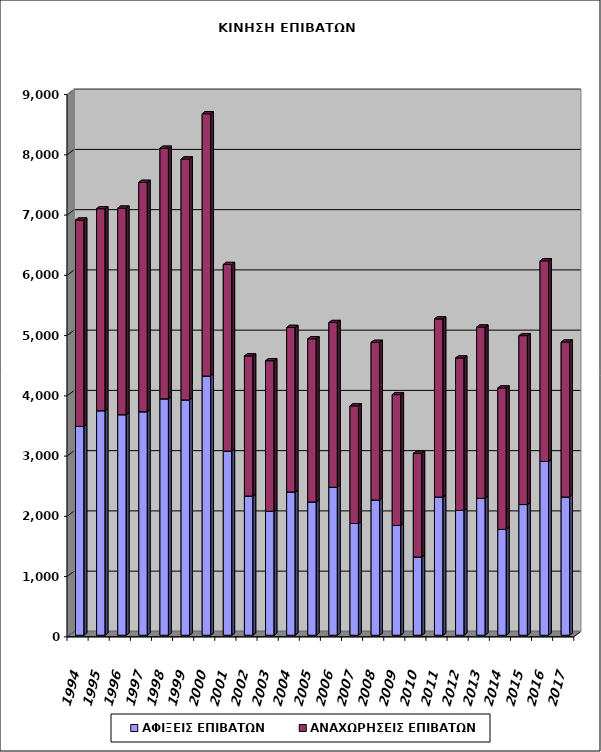
| Category | ΑΦΙΞΕΙΣ ΕΠΙΒΑΤΩΝ | ΑΝΑΧΩΡΗΣΕΙΣ ΕΠΙΒΑΤΩΝ |
|---|---|---|
| 1994.0 | 3466 | 3424 |
| 1995.0 | 3726 | 3353 |
| 1996.0 | 3660 | 3428 |
| 1997.0 | 3709 | 3807 |
| 1998.0 | 3923 | 4159 |
| 1999.0 | 3905 | 3999 |
| 2000.0 | 4302 | 4353 |
| 2001.0 | 3056 | 3097 |
| 2002.0 | 2310 | 2325 |
| 2003.0 | 2057 | 2498 |
| 2004.0 | 2378 | 2730 |
| 2005.0 | 2212 | 2708 |
| 2006.0 | 2456 | 2734 |
| 2007.0 | 1854 | 1952 |
| 2008.0 | 2244 | 2616 |
| 2009.0 | 1822 | 2171 |
| 2010.0 | 1298 | 1721 |
| 2011.0 | 2294 | 2955 |
| 2012.0 | 2072 | 2530 |
| 2013.0 | 2272 | 2843 |
| 2014.0 | 1757 | 2347 |
| 2015.0 | 2169 | 2803 |
| 2016.0 | 2885 | 3329 |
| 2017.0 | 2294 | 2571 |